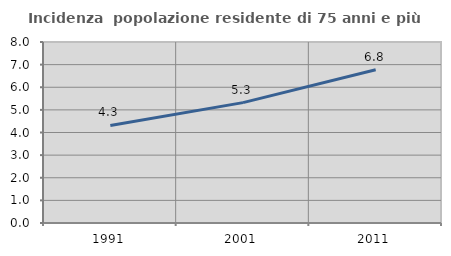
| Category | Incidenza  popolazione residente di 75 anni e più |
|---|---|
| 1991.0 | 4.311 |
| 2001.0 | 5.32 |
| 2011.0 | 6.773 |